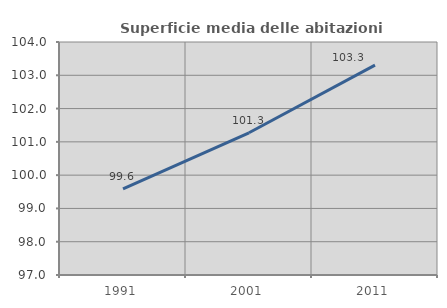
| Category | Superficie media delle abitazioni occupate |
|---|---|
| 1991.0 | 99.584 |
| 2001.0 | 101.273 |
| 2011.0 | 103.305 |